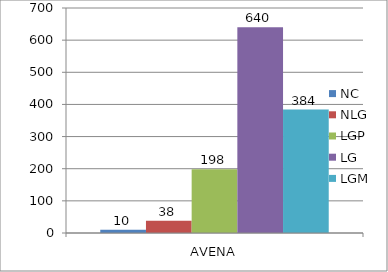
| Category | NC | NLG | LGP | LG | LGM |
|---|---|---|---|---|---|
| 0 | 10 | 38 | 198 | 640 | 384 |